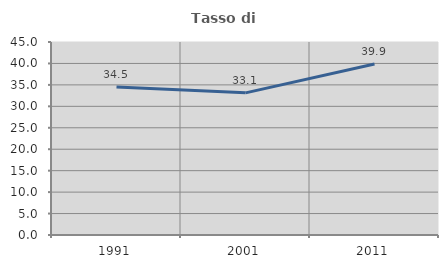
| Category | Tasso di occupazione   |
|---|---|
| 1991.0 | 34.5 |
| 2001.0 | 33.143 |
| 2011.0 | 39.873 |